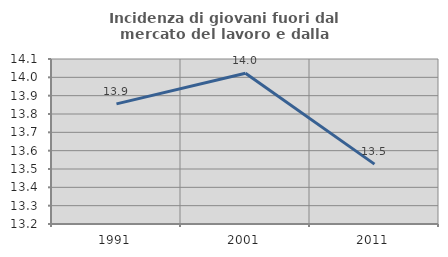
| Category | Incidenza di giovani fuori dal mercato del lavoro e dalla formazione  |
|---|---|
| 1991.0 | 13.855 |
| 2001.0 | 14.022 |
| 2011.0 | 13.527 |